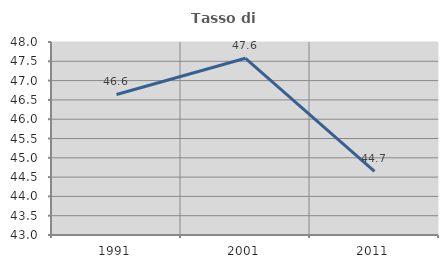
| Category | Tasso di occupazione   |
|---|---|
| 1991.0 | 46.64 |
| 2001.0 | 47.578 |
| 2011.0 | 44.65 |